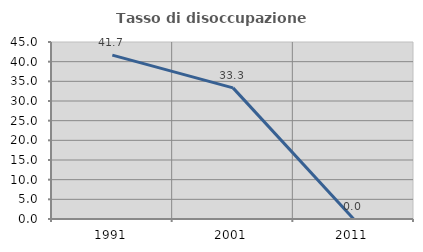
| Category | Tasso di disoccupazione giovanile  |
|---|---|
| 1991.0 | 41.667 |
| 2001.0 | 33.333 |
| 2011.0 | 0 |